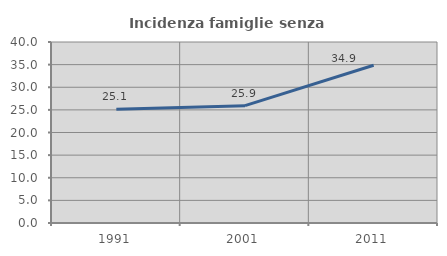
| Category | Incidenza famiglie senza nuclei |
|---|---|
| 1991.0 | 25.128 |
| 2001.0 | 25.934 |
| 2011.0 | 34.871 |